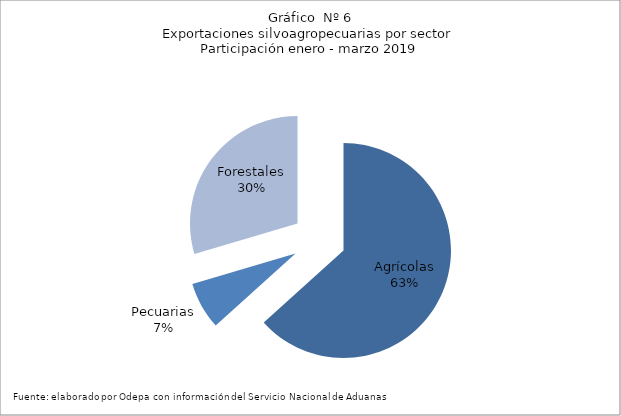
| Category | Series 0 |
|---|---|
| Agrícolas | 3014325 |
| Pecuarias | 339560 |
| Forestales | 1407589 |